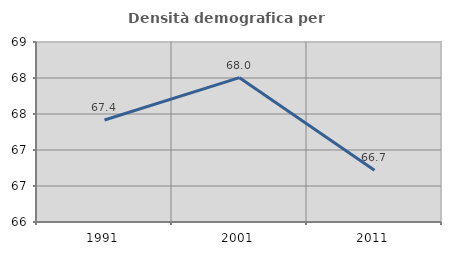
| Category | Densità demografica |
|---|---|
| 1991.0 | 67.417 |
| 2001.0 | 68.004 |
| 2011.0 | 66.718 |